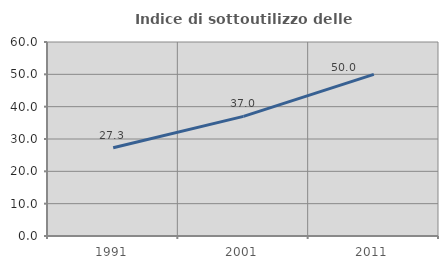
| Category | Indice di sottoutilizzo delle abitazioni  |
|---|---|
| 1991.0 | 27.298 |
| 2001.0 | 37.001 |
| 2011.0 | 50 |